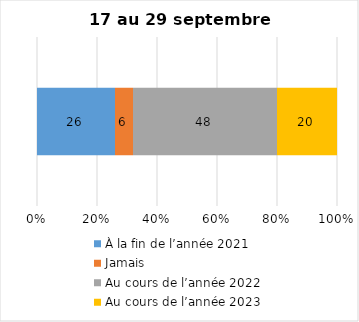
| Category | À la fin de l’année 2021 | Jamais | Au cours de l’année 2022 | Au cours de l’année 2023 |
|---|---|---|---|---|
| 0 | 26 | 6 | 48 | 20 |